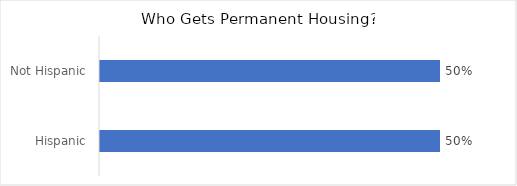
| Category | Series 0 |
|---|---|
| Hispanic | 0.5 |
| Not Hispanic | 0.5 |